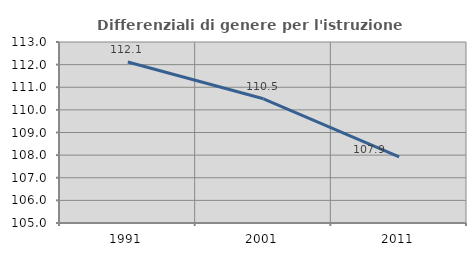
| Category | Differenziali di genere per l'istruzione superiore |
|---|---|
| 1991.0 | 112.115 |
| 2001.0 | 110.49 |
| 2011.0 | 107.926 |